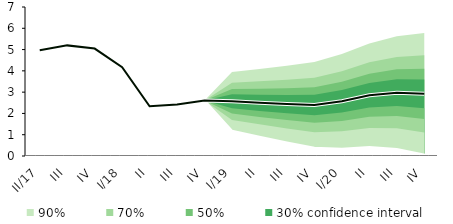
| Category | linka | Střed předpovědi |
|---|---|---|
| II/17 | 4.963 | 4.963 |
| III | 5.197 | 5.197 |
| IV | 5.048 | 5.048 |
| I/18 | 4.173 | 4.173 |
| II | 2.333 | 2.333 |
| III | 2.421 | 2.421 |
| IV | 2.609 | 2.609 |
| I/19 | 2.569 | 2.569 |
| II | 2.496 | 2.496 |
| III | 2.437 | 2.437 |
| IV | 2.397 | 2.397 |
| I/20 | 2.57 | 2.57 |
| II | 2.856 | 2.856 |
| III | 2.976 | 2.976 |
| IV | 2.919 | 2.919 |